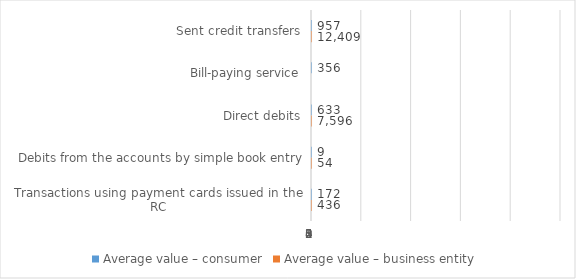
| Category | Average value – consumer | Average value – business entity  |
|---|---|---|
| Sent credit transfers | 957.107 | 12408.559 |
| Bill-paying service | 355.987 | 0 |
| Direct debits | 633.487 | 7595.918 |
| Debits from the accounts by simple book entry | 9.321 | 53.853 |
| Transactions using payment cards issued in the RC | 172.198 | 435.594 |